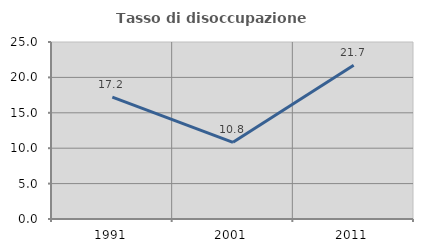
| Category | Tasso di disoccupazione giovanile  |
|---|---|
| 1991.0 | 17.204 |
| 2001.0 | 10.833 |
| 2011.0 | 21.717 |